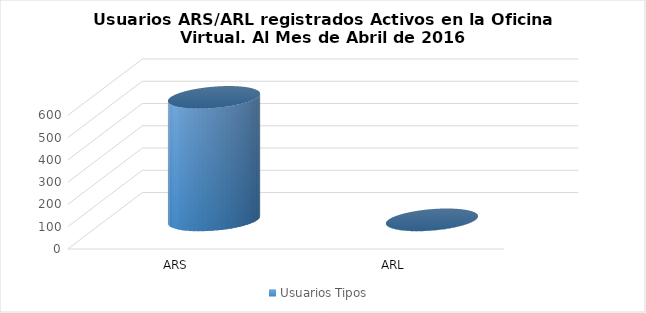
| Category | Usuarios Tipos |
|---|---|
| ARS | 551 |
| ARL | 1 |